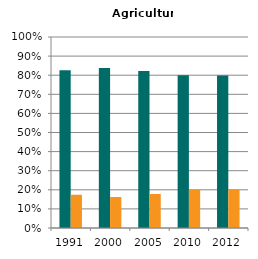
| Category | Male | Female |
|---|---|---|
| 1991.0 | 0.826 | 0.174 |
| 2000.0 | 0.838 | 0.162 |
| 2005.0 | 0.822 | 0.178 |
| 2010.0 | 0.8 | 0.2 |
| 2012.0 | 0.798 | 0.202 |